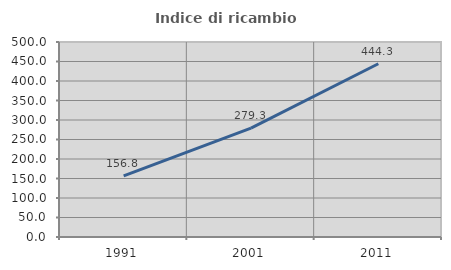
| Category | Indice di ricambio occupazionale  |
|---|---|
| 1991.0 | 156.835 |
| 2001.0 | 279.31 |
| 2011.0 | 444.311 |